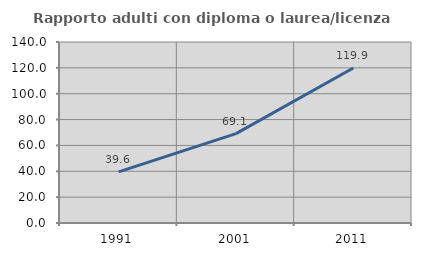
| Category | Rapporto adulti con diploma o laurea/licenza media  |
|---|---|
| 1991.0 | 39.565 |
| 2001.0 | 69.111 |
| 2011.0 | 119.931 |